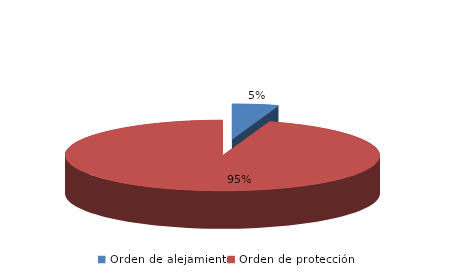
| Category | Series 0 |
|---|---|
| Orden de alejamiento | 5 |
| Orden de protección | 100 |